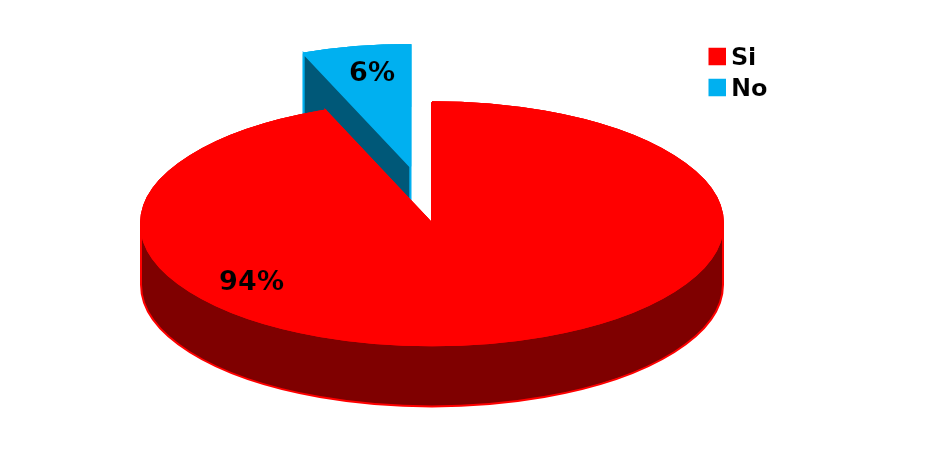
| Category | Series 0 |
|---|---|
| Si | 63 |
| No | 4 |